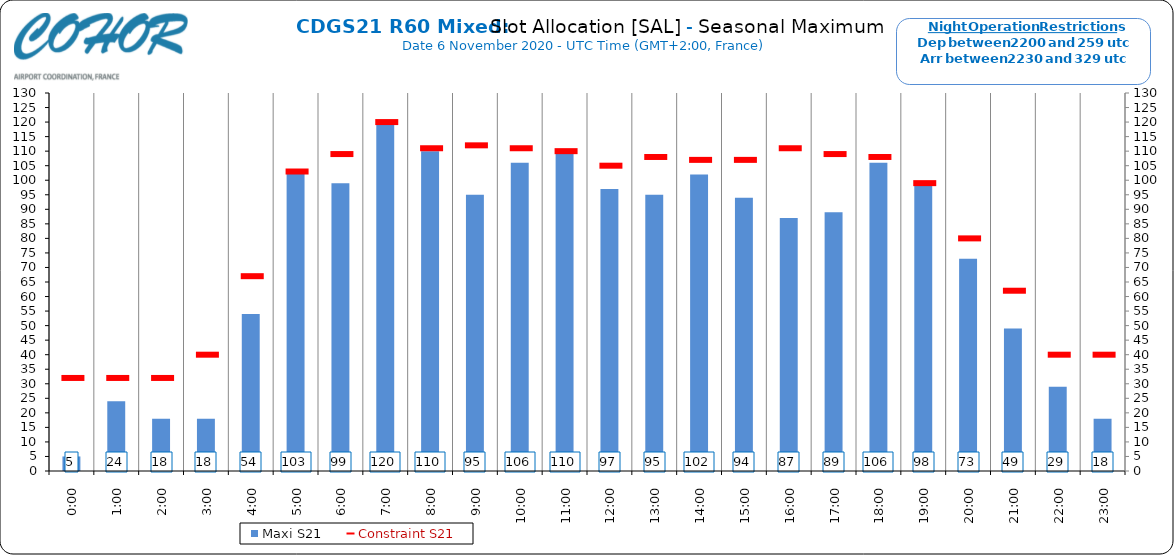
| Category | Maxi S21 |
|---|---|
| 0:00 | 5 |
| 1:00 | 24 |
| 2:00 | 18 |
| 3:00 | 18 |
| 4:00 | 54 |
| 5:00 | 103 |
| 6:00 | 99 |
| 7:00 | 120 |
| 8:00 | 110 |
| 9:00 | 95 |
| 10:00 | 106 |
| 11:00 | 110 |
| 12:00 | 97 |
| 13:00 | 95 |
| 14:00 | 102 |
| 15:00 | 94 |
| 16:00 | 87 |
| 17:00 | 89 |
| 18:00 | 106 |
| 19:00 | 98 |
| 20:00 | 73 |
| 21:00 | 49 |
| 22:00 | 29 |
| 23:00 | 18 |